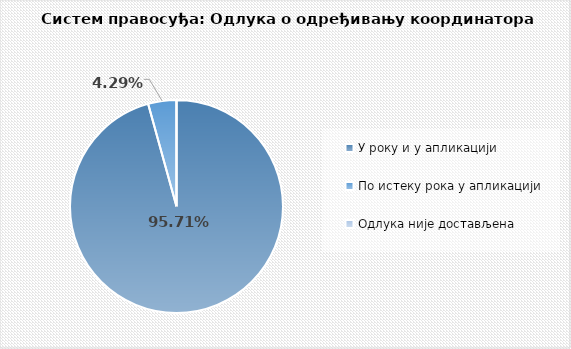
| Category | Series 0 |
|---|---|
| У року и у апликацији | 0.957 |
| По истеку рока у апликацији | 0.043 |
| Одлука није достављена | 0 |